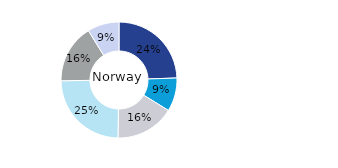
| Category | Norway |
|---|---|
| Office | 0.244 |
| Residential | 0.093 |
| Retail | 0.165 |
| Logistics* | 0.245 |
| Public Sector** | 0.164 |
| Other | 0.088 |